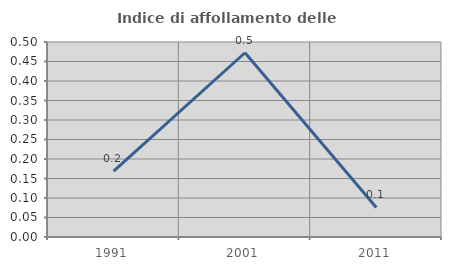
| Category | Indice di affollamento delle abitazioni  |
|---|---|
| 1991.0 | 0.169 |
| 2001.0 | 0.472 |
| 2011.0 | 0.076 |